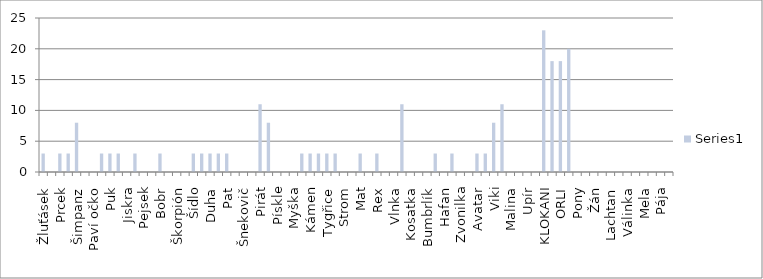
| Category | Series 0 | Series 1 | Series 2 | Series 3 | Series 4 | Series 5 | Series 6 | Series 7 | Series 8 | Series 9 | Series 10 | Series 11 | Series 12 | Series 13 | Series 14 | Series 15 | Series 16 | Series 17 | Series 18 | Series 19 | Series 20 | Series 21 | Series 22 | Series 23 | Series 24 | Series 25 | Series 26 | Series 27 | Series 28 | Series 29 | Series 30 |
|---|---|---|---|---|---|---|---|---|---|---|---|---|---|---|---|---|---|---|---|---|---|---|---|---|---|---|---|---|---|---|---|
| Žluťásek |  |  |  |  |  |  |  |  |  |  |  |  |  |  |  |  |  |  |  |  |  |  |  |  |  |  |  |  |  |  | 3 |
| Kuky |  |  |  |  |  |  |  |  |  |  |  |  |  |  |  |  |  |  |  |  |  |  |  |  |  |  |  |  |  |  | 0 |
| Prcek |  |  |  |  |  |  |  |  |  |  |  |  |  |  |  |  |  |  |  |  |  |  |  |  |  |  |  |  |  |  | 3 |
| Kostka |  |  |  |  |  |  |  |  |  |  |  |  |  |  |  |  |  |  |  |  |  |  |  |  |  |  |  |  |  |  | 3 |
| Šimpanz |  |  |  |  |  |  |  |  |  |  |  |  |  |  |  |  |  |  |  |  |  |  |  |  |  |  |  |  |  |  | 8 |
| Meloun |  |  |  |  |  |  |  |  |  |  |  |  |  |  |  |  |  |  |  |  |  |  |  |  |  |  |  |  |  |  | 0 |
| Paví očko |  |  |  |  |  |  |  |  |  |  |  |  |  |  |  |  |  |  |  |  |  |  |  |  |  |  |  |  |  |  | 0 |
| Perlička |  |  |  |  |  |  |  |  |  |  |  |  |  |  |  |  |  |  |  |  |  |  |  |  |  |  |  |  |  |  | 3 |
| Puk |  |  |  |  |  |  |  |  |  |  |  |  |  |  |  |  |  |  |  |  |  |  |  |  |  |  |  |  |  |  | 3 |
| Datel |  |  |  |  |  |  |  |  |  |  |  |  |  |  |  |  |  |  |  |  |  |  |  |  |  |  |  |  |  |  | 3 |
| Jiskra |  |  |  |  |  |  |  |  |  |  |  |  |  |  |  |  |  |  |  |  |  |  |  |  |  |  |  |  |  |  | 0 |
| Hvězda |  |  |  |  |  |  |  |  |  |  |  |  |  |  |  |  |  |  |  |  |  |  |  |  |  |  |  |  |  |  | 3 |
| Pejsek |  |  |  |  |  |  |  |  |  |  |  |  |  |  |  |  |  |  |  |  |  |  |  |  |  |  |  |  |  |  | 0 |
| Alfík |  |  |  |  |  |  |  |  |  |  |  |  |  |  |  |  |  |  |  |  |  |  |  |  |  |  |  |  |  |  | 0 |
| Bobr |  |  |  |  |  |  |  |  |  |  |  |  |  |  |  |  |  |  |  |  |  |  |  |  |  |  |  |  |  |  | 3 |
| Světluška |  |  |  |  |  |  |  |  |  |  |  |  |  |  |  |  |  |  |  |  |  |  |  |  |  |  |  |  |  |  | 0 |
| Škorpión |  |  |  |  |  |  |  |  |  |  |  |  |  |  |  |  |  |  |  |  |  |  |  |  |  |  |  |  |  |  | 0 |
| Kamzík |  |  |  |  |  |  |  |  |  |  |  |  |  |  |  |  |  |  |  |  |  |  |  |  |  |  |  |  |  |  | 0 |
| Šídlo |  |  |  |  |  |  |  |  |  |  |  |  |  |  |  |  |  |  |  |  |  |  |  |  |  |  |  |  |  |  | 3 |
| Jahoda |  |  |  |  |  |  |  |  |  |  |  |  |  |  |  |  |  |  |  |  |  |  |  |  |  |  |  |  |  |  | 3 |
| Duha |  |  |  |  |  |  |  |  |  |  |  |  |  |  |  |  |  |  |  |  |  |  |  |  |  |  |  |  |  |  | 3 |
| Irbis |  |  |  |  |  |  |  |  |  |  |  |  |  |  |  |  |  |  |  |  |  |  |  |  |  |  |  |  |  |  | 3 |
| Pat |  |  |  |  |  |  |  |  |  |  |  |  |  |  |  |  |  |  |  |  |  |  |  |  |  |  |  |  |  |  | 3 |
| Meduňka |  |  |  |  |  |  |  |  |  |  |  |  |  |  |  |  |  |  |  |  |  |  |  |  |  |  |  |  |  |  | 0 |
| Šnekovič |  |  |  |  |  |  |  |  |  |  |  |  |  |  |  |  |  |  |  |  |  |  |  |  |  |  |  |  |  |  | 0 |
| Hříbeček |  |  |  |  |  |  |  |  |  |  |  |  |  |  |  |  |  |  |  |  |  |  |  |  |  |  |  |  |  |  | 0 |
| Pirát |  |  |  |  |  |  |  |  |  |  |  |  |  |  |  |  |  |  |  |  |  |  |  |  |  |  |  |  |  |  | 11 |
| Ledňáček |  |  |  |  |  |  |  |  |  |  |  |  |  |  |  |  |  |  |  |  |  |  |  |  |  |  |  |  |  |  | 8 |
| Pískle |  |  |  |  |  |  |  |  |  |  |  |  |  |  |  |  |  |  |  |  |  |  |  |  |  |  |  |  |  |  | 0 |
| Žížala |  |  |  |  |  |  |  |  |  |  |  |  |  |  |  |  |  |  |  |  |  |  |  |  |  |  |  |  |  |  | 0 |
| Myška |  |  |  |  |  |  |  |  |  |  |  |  |  |  |  |  |  |  |  |  |  |  |  |  |  |  |  |  |  |  | 0 |
| Rolnička |  |  |  |  |  |  |  |  |  |  |  |  |  |  |  |  |  |  |  |  |  |  |  |  |  |  |  |  |  |  | 3 |
| Kámen |  |  |  |  |  |  |  |  |  |  |  |  |  |  |  |  |  |  |  |  |  |  |  |  |  |  |  |  |  |  | 3 |
| Kulíšek |  |  |  |  |  |  |  |  |  |  |  |  |  |  |  |  |  |  |  |  |  |  |  |  |  |  |  |  |  |  | 3 |
| Tygřice |  |  |  |  |  |  |  |  |  |  |  |  |  |  |  |  |  |  |  |  |  |  |  |  |  |  |  |  |  |  | 3 |
| Zaječice |  |  |  |  |  |  |  |  |  |  |  |  |  |  |  |  |  |  |  |  |  |  |  |  |  |  |  |  |  |  | 3 |
| Strom |  |  |  |  |  |  |  |  |  |  |  |  |  |  |  |  |  |  |  |  |  |  |  |  |  |  |  |  |  |  | 0 |
| Činčila |  |  |  |  |  |  |  |  |  |  |  |  |  |  |  |  |  |  |  |  |  |  |  |  |  |  |  |  |  |  | 0 |
| Mat |  |  |  |  |  |  |  |  |  |  |  |  |  |  |  |  |  |  |  |  |  |  |  |  |  |  |  |  |  |  | 3 |
| Stopař |  |  |  |  |  |  |  |  |  |  |  |  |  |  |  |  |  |  |  |  |  |  |  |  |  |  |  |  |  |  | 0 |
| Rex |  |  |  |  |  |  |  |  |  |  |  |  |  |  |  |  |  |  |  |  |  |  |  |  |  |  |  |  |  |  | 3 |
| Skřítek |  |  |  |  |  |  |  |  |  |  |  |  |  |  |  |  |  |  |  |  |  |  |  |  |  |  |  |  |  |  | 0 |
| Vlnka |  |  |  |  |  |  |  |  |  |  |  |  |  |  |  |  |  |  |  |  |  |  |  |  |  |  |  |  |  |  | 0 |
| Vojta Pavlas |  |  |  |  |  |  |  |  |  |  |  |  |  |  |  |  |  |  |  |  |  |  |  |  |  |  |  |  |  |  | 11 |
| Kosatka |  |  |  |  |  |  |  |  |  |  |  |  |  |  |  |  |  |  |  |  |  |  |  |  |  |  |  |  |  |  | 0 |
| Fišky |  |  |  |  |  |  |  |  |  |  |  |  |  |  |  |  |  |  |  |  |  |  |  |  |  |  |  |  |  |  | 0 |
| Bumbrlík |  |  |  |  |  |  |  |  |  |  |  |  |  |  |  |  |  |  |  |  |  |  |  |  |  |  |  |  |  |  | 0 |
| Mlok |  |  |  |  |  |  |  |  |  |  |  |  |  |  |  |  |  |  |  |  |  |  |  |  |  |  |  |  |  |  | 3 |
| Hafan |  |  |  |  |  |  |  |  |  |  |  |  |  |  |  |  |  |  |  |  |  |  |  |  |  |  |  |  |  |  | 0 |
| Lama |  |  |  |  |  |  |  |  |  |  |  |  |  |  |  |  |  |  |  |  |  |  |  |  |  |  |  |  |  |  | 3 |
| Zvonilka |  |  |  |  |  |  |  |  |  |  |  |  |  |  |  |  |  |  |  |  |  |  |  |  |  |  |  |  |  |  | 0 |
| Loď |  |  |  |  |  |  |  |  |  |  |  |  |  |  |  |  |  |  |  |  |  |  |  |  |  |  |  |  |  |  | 0 |
| Avatar |  |  |  |  |  |  |  |  |  |  |  |  |  |  |  |  |  |  |  |  |  |  |  |  |  |  |  |  |  |  | 3 |
| Rejsek |  |  |  |  |  |  |  |  |  |  |  |  |  |  |  |  |  |  |  |  |  |  |  |  |  |  |  |  |  |  | 3 |
| Viki |  |  |  |  |  |  |  |  |  |  |  |  |  |  |  |  |  |  |  |  |  |  |  |  |  |  |  |  |  |  | 8 |
| Drop |  |  |  |  |  |  |  |  |  |  |  |  |  |  |  |  |  |  |  |  |  |  |  |  |  |  |  |  |  |  | 11 |
| Malina |  |  |  |  |  |  |  |  |  |  |  |  |  |  |  |  |  |  |  |  |  |  |  |  |  |  |  |  |  |  | 0 |
| Racek |  |  |  |  |  |  |  |  |  |  |  |  |  |  |  |  |  |  |  |  |  |  |  |  |  |  |  |  |  |  | 0 |
| Upír |  |  |  |  |  |  |  |  |  |  |  |  |  |  |  |  |  |  |  |  |  |  |  |  |  |  |  |  |  |  | 0 |
| Kwaki |  |  |  |  |  |  |  |  |  |  |  |  |  |  |  |  |  |  |  |  |  |  |  |  |  |  |  |  |  |  | 0 |
| KLOKANI |  |  |  |  |  |  |  |  |  |  |  |  |  |  |  |  |  |  |  |  |  |  |  |  |  |  |  |  |  |  | 23 |
| DELFÍNI |  |  |  |  |  |  |  |  |  |  |  |  |  |  |  |  |  |  |  |  |  |  |  |  |  |  |  |  |  |  | 18 |
| ORLI |  |  |  |  |  |  |  |  |  |  |  |  |  |  |  |  |  |  |  |  |  |  |  |  |  |  |  |  |  |  | 18 |
| BOBŘI |  |  |  |  |  |  |  |  |  |  |  |  |  |  |  |  |  |  |  |  |  |  |  |  |  |  |  |  |  |  | 20 |
| Pony |  |  |  |  |  |  |  |  |  |  |  |  |  |  |  |  |  |  |  |  |  |  |  |  |  |  |  |  |  |  | 0 |
| Kiwi |  |  |  |  |  |  |  |  |  |  |  |  |  |  |  |  |  |  |  |  |  |  |  |  |  |  |  |  |  |  | 0 |
| Žán |  |  |  |  |  |  |  |  |  |  |  |  |  |  |  |  |  |  |  |  |  |  |  |  |  |  |  |  |  |  | 0 |
| Maceška |  |  |  |  |  |  |  |  |  |  |  |  |  |  |  |  |  |  |  |  |  |  |  |  |  |  |  |  |  |  | 0 |
| Lachtan |  |  |  |  |  |  |  |  |  |  |  |  |  |  |  |  |  |  |  |  |  |  |  |  |  |  |  |  |  |  | 0 |
| Grep |  |  |  |  |  |  |  |  |  |  |  |  |  |  |  |  |  |  |  |  |  |  |  |  |  |  |  |  |  |  | 0 |
| Válinka |  |  |  |  |  |  |  |  |  |  |  |  |  |  |  |  |  |  |  |  |  |  |  |  |  |  |  |  |  |  | 0 |
| Silver |  |  |  |  |  |  |  |  |  |  |  |  |  |  |  |  |  |  |  |  |  |  |  |  |  |  |  |  |  |  | 0 |
| Mela |  |  |  |  |  |  |  |  |  |  |  |  |  |  |  |  |  |  |  |  |  |  |  |  |  |  |  |  |  |  | 0 |
| Kobylka |  |  |  |  |  |  |  |  |  |  |  |  |  |  |  |  |  |  |  |  |  |  |  |  |  |  |  |  |  |  | 0 |
| Pája |  |  |  |  |  |  |  |  |  |  |  |  |  |  |  |  |  |  |  |  |  |  |  |  |  |  |  |  |  |  | 0 |
| Muška |  |  |  |  |  |  |  |  |  |  |  |  |  |  |  |  |  |  |  |  |  |  |  |  |  |  |  |  |  |  | 0 |